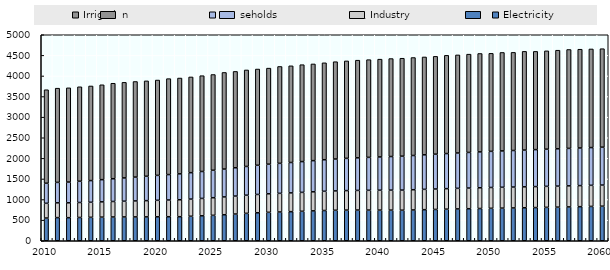
| Category | Electricity | Industry | Households | Irrigation |
|---|---|---|---|---|
| 2010.0 | 551.158 | 358.158 | 486.844 | 2269.541 |
| 2011.0 | 561.928 | 358.649 | 496.192 | 2286.638 |
| 2012.0 | 560.23 | 360.759 | 504.091 | 2286.781 |
| 2013.0 | 565.097 | 363.603 | 515.366 | 2293.365 |
| 2014.0 | 568.656 | 365.579 | 526.236 | 2296.465 |
| 2015.0 | 573.453 | 370.849 | 538.791 | 2302.61 |
| 2016.0 | 577.083 | 376.271 | 551.948 | 2317.538 |
| 2017.0 | 578.069 | 381.974 | 565.168 | 2319.766 |
| 2018.0 | 578.852 | 387.939 | 578.44 | 2320.179 |
| 2019.0 | 579.526 | 394.136 | 591.75 | 2315.23 |
| 2020.0 | 581.382 | 400.382 | 605.087 | 2314.217 |
| 2021.0 | 583.464 | 405.631 | 617.168 | 2328.695 |
| 2022.0 | 583.902 | 411.033 | 629.29 | 2325.62 |
| 2023.0 | 594.628 | 416.557 | 641.445 | 2323.78 |
| 2024.0 | 605.515 | 422.214 | 653.622 | 2325.289 |
| 2025.0 | 617.056 | 427.99 | 665.809 | 2324.173 |
| 2026.0 | 631.801 | 432.083 | 676.424 | 2344.714 |
| 2027.0 | 648.75 | 436.256 | 687.065 | 2338.19 |
| 2028.0 | 665.35 | 440.513 | 697.723 | 2342.032 |
| 2029.0 | 679.023 | 444.866 | 708.392 | 2335.878 |
| 2030.0 | 690.347 | 449.305 | 719.064 | 2331.443 |
| 2031.0 | 698.293 | 452.472 | 728.382 | 2351.025 |
| 2032.0 | 706.026 | 455.712 | 737.71 | 2346.768 |
| 2033.0 | 715.364 | 459.04 | 747.042 | 2352.023 |
| 2034.0 | 725.626 | 462.464 | 756.371 | 2347.474 |
| 2035.0 | 734.08 | 466.655 | 765.692 | 2352.794 |
| 2036.0 | 740.127 | 469.826 | 774.182 | 2361.898 |
| 2037.0 | 744.405 | 473.052 | 782.668 | 2365.256 |
| 2038.0 | 745.486 | 476.356 | 791.144 | 2369.982 |
| 2039.0 | 744.819 | 479.732 | 799.601 | 2371.638 |
| 2040.0 | 743.38 | 483.182 | 808.034 | 2373.021 |
| 2041.0 | 742.97 | 485.636 | 815.574 | 2378.19 |
| 2042.0 | 741.715 | 488.167 | 823.088 | 2377.33 |
| 2043.0 | 748.171 | 490.767 | 830.571 | 2377.719 |
| 2044.0 | 754.65 | 493.433 | 838.015 | 2375.079 |
| 2045.0 | 760.18 | 496.164 | 845.412 | 2374.37 |
| 2046.0 | 766.698 | 497.908 | 851.823 | 2384.166 |
| 2047.0 | 772.586 | 499.709 | 858.181 | 2380.295 |
| 2048.0 | 777.658 | 501.574 | 864.479 | 2385.551 |
| 2049.0 | 782.704 | 503.515 | 870.709 | 2388.514 |
| 2050.0 | 787.517 | 505.525 | 876.864 | 2379.222 |
| 2051.0 | 792.152 | 506.28 | 882.048 | 2389.957 |
| 2052.0 | 796.559 | 507.095 | 887.144 | 2381.574 |
| 2053.0 | 801.078 | 507.972 | 892.146 | 2395.916 |
| 2054.0 | 805.896 | 508.91 | 897.048 | 2384.458 |
| 2055.0 | 810.978 | 509.908 | 901.844 | 2386.831 |
| 2056.0 | 816.027 | 510.332 | 905.649 | 2393.077 |
| 2057.0 | 821.74 | 510.81 | 909.338 | 2400.344 |
| 2058.0 | 827.458 | 511.342 | 912.907 | 2397.203 |
| 2059.0 | 833.55 | 511.929 | 916.352 | 2393.665 |
| 2060.0 | 839.198 | 512.571 | 919.67 | 2390.025 |